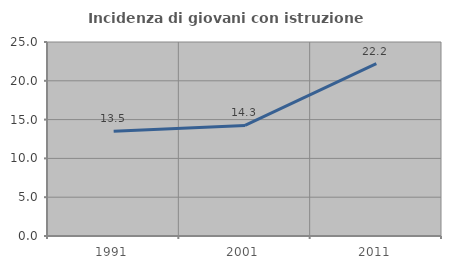
| Category | Incidenza di giovani con istruzione universitaria |
|---|---|
| 1991.0 | 13.514 |
| 2001.0 | 14.255 |
| 2011.0 | 22.222 |